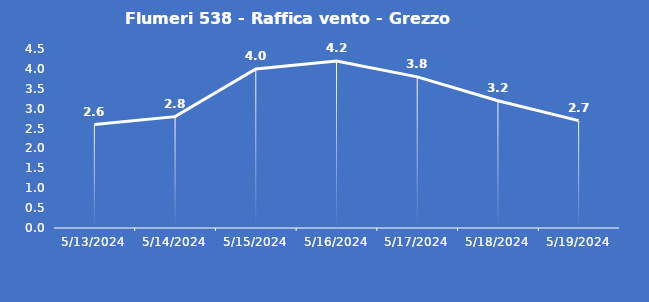
| Category | Flumeri 538 - Raffica vento - Grezzo (m/s) |
|---|---|
| 5/13/24 | 2.6 |
| 5/14/24 | 2.8 |
| 5/15/24 | 4 |
| 5/16/24 | 4.2 |
| 5/17/24 | 3.8 |
| 5/18/24 | 3.2 |
| 5/19/24 | 2.7 |